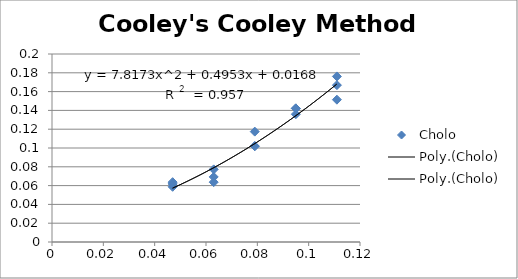
| Category | Cholo |
|---|---|
| 0.111 | 0.151 |
| 0.111 | 0.176 |
| 0.111 | 0.167 |
| 0.095 | 0.136 |
| 0.095 | 0.142 |
| 0.095 | 0.142 |
| 0.079 | 0.117 |
| 0.079 | 0.102 |
| 0.079 | 0.102 |
| 0.063 | 0.069 |
| 0.063 | 0.077 |
| 0.063 | 0.064 |
| 0.047 | 0.064 |
| 0.047 | 0.059 |
| 0.047 | 0.062 |